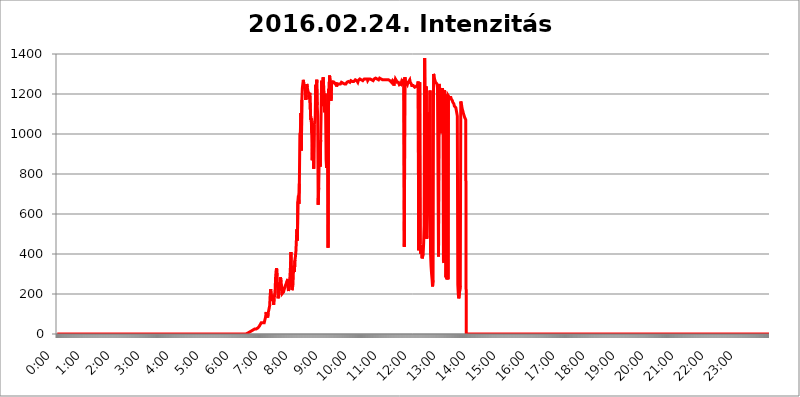
| Category | 2016.02.24. Intenzitás [W/m^2] |
|---|---|
| 0.0 | 0 |
| 0.0006944444444444445 | 0 |
| 0.001388888888888889 | 0 |
| 0.0020833333333333333 | 0 |
| 0.002777777777777778 | 0 |
| 0.003472222222222222 | 0 |
| 0.004166666666666667 | 0 |
| 0.004861111111111111 | 0 |
| 0.005555555555555556 | 0 |
| 0.0062499999999999995 | 0 |
| 0.006944444444444444 | 0 |
| 0.007638888888888889 | 0 |
| 0.008333333333333333 | 0 |
| 0.009027777777777779 | 0 |
| 0.009722222222222222 | 0 |
| 0.010416666666666666 | 0 |
| 0.011111111111111112 | 0 |
| 0.011805555555555555 | 0 |
| 0.012499999999999999 | 0 |
| 0.013194444444444444 | 0 |
| 0.013888888888888888 | 0 |
| 0.014583333333333332 | 0 |
| 0.015277777777777777 | 0 |
| 0.015972222222222224 | 0 |
| 0.016666666666666666 | 0 |
| 0.017361111111111112 | 0 |
| 0.018055555555555557 | 0 |
| 0.01875 | 0 |
| 0.019444444444444445 | 0 |
| 0.02013888888888889 | 0 |
| 0.020833333333333332 | 0 |
| 0.02152777777777778 | 0 |
| 0.022222222222222223 | 0 |
| 0.02291666666666667 | 0 |
| 0.02361111111111111 | 0 |
| 0.024305555555555556 | 0 |
| 0.024999999999999998 | 0 |
| 0.025694444444444447 | 0 |
| 0.02638888888888889 | 0 |
| 0.027083333333333334 | 0 |
| 0.027777777777777776 | 0 |
| 0.02847222222222222 | 0 |
| 0.029166666666666664 | 0 |
| 0.029861111111111113 | 0 |
| 0.030555555555555555 | 0 |
| 0.03125 | 0 |
| 0.03194444444444445 | 0 |
| 0.03263888888888889 | 0 |
| 0.03333333333333333 | 0 |
| 0.034027777777777775 | 0 |
| 0.034722222222222224 | 0 |
| 0.035416666666666666 | 0 |
| 0.036111111111111115 | 0 |
| 0.03680555555555556 | 0 |
| 0.0375 | 0 |
| 0.03819444444444444 | 0 |
| 0.03888888888888889 | 0 |
| 0.03958333333333333 | 0 |
| 0.04027777777777778 | 0 |
| 0.04097222222222222 | 0 |
| 0.041666666666666664 | 0 |
| 0.042361111111111106 | 0 |
| 0.04305555555555556 | 0 |
| 0.043750000000000004 | 0 |
| 0.044444444444444446 | 0 |
| 0.04513888888888889 | 0 |
| 0.04583333333333334 | 0 |
| 0.04652777777777778 | 0 |
| 0.04722222222222222 | 0 |
| 0.04791666666666666 | 0 |
| 0.04861111111111111 | 0 |
| 0.049305555555555554 | 0 |
| 0.049999999999999996 | 0 |
| 0.05069444444444445 | 0 |
| 0.051388888888888894 | 0 |
| 0.052083333333333336 | 0 |
| 0.05277777777777778 | 0 |
| 0.05347222222222222 | 0 |
| 0.05416666666666667 | 0 |
| 0.05486111111111111 | 0 |
| 0.05555555555555555 | 0 |
| 0.05625 | 0 |
| 0.05694444444444444 | 0 |
| 0.057638888888888885 | 0 |
| 0.05833333333333333 | 0 |
| 0.05902777777777778 | 0 |
| 0.059722222222222225 | 0 |
| 0.06041666666666667 | 0 |
| 0.061111111111111116 | 0 |
| 0.06180555555555556 | 0 |
| 0.0625 | 0 |
| 0.06319444444444444 | 0 |
| 0.06388888888888888 | 0 |
| 0.06458333333333334 | 0 |
| 0.06527777777777778 | 0 |
| 0.06597222222222222 | 0 |
| 0.06666666666666667 | 0 |
| 0.06736111111111111 | 0 |
| 0.06805555555555555 | 0 |
| 0.06874999999999999 | 0 |
| 0.06944444444444443 | 0 |
| 0.07013888888888889 | 0 |
| 0.07083333333333333 | 0 |
| 0.07152777777777779 | 0 |
| 0.07222222222222223 | 0 |
| 0.07291666666666667 | 0 |
| 0.07361111111111111 | 0 |
| 0.07430555555555556 | 0 |
| 0.075 | 0 |
| 0.07569444444444444 | 0 |
| 0.0763888888888889 | 0 |
| 0.07708333333333334 | 0 |
| 0.07777777777777778 | 0 |
| 0.07847222222222222 | 0 |
| 0.07916666666666666 | 0 |
| 0.0798611111111111 | 0 |
| 0.08055555555555556 | 0 |
| 0.08125 | 0 |
| 0.08194444444444444 | 0 |
| 0.08263888888888889 | 0 |
| 0.08333333333333333 | 0 |
| 0.08402777777777777 | 0 |
| 0.08472222222222221 | 0 |
| 0.08541666666666665 | 0 |
| 0.08611111111111112 | 0 |
| 0.08680555555555557 | 0 |
| 0.08750000000000001 | 0 |
| 0.08819444444444445 | 0 |
| 0.08888888888888889 | 0 |
| 0.08958333333333333 | 0 |
| 0.09027777777777778 | 0 |
| 0.09097222222222222 | 0 |
| 0.09166666666666667 | 0 |
| 0.09236111111111112 | 0 |
| 0.09305555555555556 | 0 |
| 0.09375 | 0 |
| 0.09444444444444444 | 0 |
| 0.09513888888888888 | 0 |
| 0.09583333333333333 | 0 |
| 0.09652777777777777 | 0 |
| 0.09722222222222222 | 0 |
| 0.09791666666666667 | 0 |
| 0.09861111111111111 | 0 |
| 0.09930555555555555 | 0 |
| 0.09999999999999999 | 0 |
| 0.10069444444444443 | 0 |
| 0.1013888888888889 | 0 |
| 0.10208333333333335 | 0 |
| 0.10277777777777779 | 0 |
| 0.10347222222222223 | 0 |
| 0.10416666666666667 | 0 |
| 0.10486111111111111 | 0 |
| 0.10555555555555556 | 0 |
| 0.10625 | 0 |
| 0.10694444444444444 | 0 |
| 0.1076388888888889 | 0 |
| 0.10833333333333334 | 0 |
| 0.10902777777777778 | 0 |
| 0.10972222222222222 | 0 |
| 0.1111111111111111 | 0 |
| 0.11180555555555556 | 0 |
| 0.11180555555555556 | 0 |
| 0.1125 | 0 |
| 0.11319444444444444 | 0 |
| 0.11388888888888889 | 0 |
| 0.11458333333333333 | 0 |
| 0.11527777777777777 | 0 |
| 0.11597222222222221 | 0 |
| 0.11666666666666665 | 0 |
| 0.1173611111111111 | 0 |
| 0.11805555555555557 | 0 |
| 0.11944444444444445 | 0 |
| 0.12013888888888889 | 0 |
| 0.12083333333333333 | 0 |
| 0.12152777777777778 | 0 |
| 0.12222222222222223 | 0 |
| 0.12291666666666667 | 0 |
| 0.12291666666666667 | 0 |
| 0.12361111111111112 | 0 |
| 0.12430555555555556 | 0 |
| 0.125 | 0 |
| 0.12569444444444444 | 0 |
| 0.12638888888888888 | 0 |
| 0.12708333333333333 | 0 |
| 0.16875 | 0 |
| 0.12847222222222224 | 0 |
| 0.12916666666666668 | 0 |
| 0.12986111111111112 | 0 |
| 0.13055555555555556 | 0 |
| 0.13125 | 0 |
| 0.13194444444444445 | 0 |
| 0.1326388888888889 | 0 |
| 0.13333333333333333 | 0 |
| 0.13402777777777777 | 0 |
| 0.13402777777777777 | 0 |
| 0.13472222222222222 | 0 |
| 0.13541666666666666 | 0 |
| 0.1361111111111111 | 0 |
| 0.13749999999999998 | 0 |
| 0.13819444444444443 | 0 |
| 0.1388888888888889 | 0 |
| 0.13958333333333334 | 0 |
| 0.14027777777777778 | 0 |
| 0.14097222222222222 | 0 |
| 0.14166666666666666 | 0 |
| 0.1423611111111111 | 0 |
| 0.14305555555555557 | 0 |
| 0.14375000000000002 | 0 |
| 0.14444444444444446 | 0 |
| 0.1451388888888889 | 0 |
| 0.1451388888888889 | 0 |
| 0.14652777777777778 | 0 |
| 0.14722222222222223 | 0 |
| 0.14791666666666667 | 0 |
| 0.1486111111111111 | 0 |
| 0.14930555555555555 | 0 |
| 0.15 | 0 |
| 0.15069444444444444 | 0 |
| 0.15138888888888888 | 0 |
| 0.15208333333333332 | 0 |
| 0.15277777777777776 | 0 |
| 0.15347222222222223 | 0 |
| 0.15416666666666667 | 0 |
| 0.15486111111111112 | 0 |
| 0.15555555555555556 | 0 |
| 0.15625 | 0 |
| 0.15694444444444444 | 0 |
| 0.15763888888888888 | 0 |
| 0.15833333333333333 | 0 |
| 0.15902777777777777 | 0 |
| 0.15972222222222224 | 0 |
| 0.16041666666666668 | 0 |
| 0.16111111111111112 | 0 |
| 0.16180555555555556 | 0 |
| 0.1625 | 0 |
| 0.16319444444444445 | 0 |
| 0.1638888888888889 | 0 |
| 0.16458333333333333 | 0 |
| 0.16527777777777777 | 0 |
| 0.16597222222222222 | 0 |
| 0.16666666666666666 | 0 |
| 0.1673611111111111 | 0 |
| 0.16805555555555554 | 0 |
| 0.16874999999999998 | 0 |
| 0.16944444444444443 | 0 |
| 0.17013888888888887 | 0 |
| 0.1708333333333333 | 0 |
| 0.17152777777777775 | 0 |
| 0.17222222222222225 | 0 |
| 0.1729166666666667 | 0 |
| 0.17361111111111113 | 0 |
| 0.17430555555555557 | 0 |
| 0.17500000000000002 | 0 |
| 0.17569444444444446 | 0 |
| 0.1763888888888889 | 0 |
| 0.17708333333333334 | 0 |
| 0.17777777777777778 | 0 |
| 0.17847222222222223 | 0 |
| 0.17916666666666667 | 0 |
| 0.1798611111111111 | 0 |
| 0.18055555555555555 | 0 |
| 0.18125 | 0 |
| 0.18194444444444444 | 0 |
| 0.1826388888888889 | 0 |
| 0.18333333333333335 | 0 |
| 0.1840277777777778 | 0 |
| 0.18472222222222223 | 0 |
| 0.18541666666666667 | 0 |
| 0.18611111111111112 | 0 |
| 0.18680555555555556 | 0 |
| 0.1875 | 0 |
| 0.18819444444444444 | 0 |
| 0.18888888888888888 | 0 |
| 0.18958333333333333 | 0 |
| 0.19027777777777777 | 0 |
| 0.1909722222222222 | 0 |
| 0.19166666666666665 | 0 |
| 0.19236111111111112 | 0 |
| 0.19305555555555554 | 0 |
| 0.19375 | 0 |
| 0.19444444444444445 | 0 |
| 0.1951388888888889 | 0 |
| 0.19583333333333333 | 0 |
| 0.19652777777777777 | 0 |
| 0.19722222222222222 | 0 |
| 0.19791666666666666 | 0 |
| 0.1986111111111111 | 0 |
| 0.19930555555555554 | 0 |
| 0.19999999999999998 | 0 |
| 0.20069444444444443 | 0 |
| 0.20138888888888887 | 0 |
| 0.2020833333333333 | 0 |
| 0.2027777777777778 | 0 |
| 0.2034722222222222 | 0 |
| 0.2041666666666667 | 0 |
| 0.20486111111111113 | 0 |
| 0.20555555555555557 | 0 |
| 0.20625000000000002 | 0 |
| 0.20694444444444446 | 0 |
| 0.2076388888888889 | 0 |
| 0.20833333333333334 | 0 |
| 0.20902777777777778 | 0 |
| 0.20972222222222223 | 0 |
| 0.21041666666666667 | 0 |
| 0.2111111111111111 | 0 |
| 0.21180555555555555 | 0 |
| 0.2125 | 0 |
| 0.21319444444444444 | 0 |
| 0.2138888888888889 | 0 |
| 0.21458333333333335 | 0 |
| 0.2152777777777778 | 0 |
| 0.21597222222222223 | 0 |
| 0.21666666666666667 | 0 |
| 0.21736111111111112 | 0 |
| 0.21805555555555556 | 0 |
| 0.21875 | 0 |
| 0.21944444444444444 | 0 |
| 0.22013888888888888 | 0 |
| 0.22083333333333333 | 0 |
| 0.22152777777777777 | 0 |
| 0.2222222222222222 | 0 |
| 0.22291666666666665 | 0 |
| 0.2236111111111111 | 0 |
| 0.22430555555555556 | 0 |
| 0.225 | 0 |
| 0.22569444444444445 | 0 |
| 0.2263888888888889 | 0 |
| 0.22708333333333333 | 0 |
| 0.22777777777777777 | 0 |
| 0.22847222222222222 | 0 |
| 0.22916666666666666 | 0 |
| 0.2298611111111111 | 0 |
| 0.23055555555555554 | 0 |
| 0.23124999999999998 | 0 |
| 0.23194444444444443 | 0 |
| 0.23263888888888887 | 0 |
| 0.2333333333333333 | 0 |
| 0.2340277777777778 | 0 |
| 0.2347222222222222 | 0 |
| 0.2354166666666667 | 0 |
| 0.23611111111111113 | 0 |
| 0.23680555555555557 | 0 |
| 0.23750000000000002 | 0 |
| 0.23819444444444446 | 0 |
| 0.2388888888888889 | 0 |
| 0.23958333333333334 | 0 |
| 0.24027777777777778 | 0 |
| 0.24097222222222223 | 0 |
| 0.24166666666666667 | 0 |
| 0.2423611111111111 | 0 |
| 0.24305555555555555 | 0 |
| 0.24375 | 0 |
| 0.24444444444444446 | 0 |
| 0.24513888888888888 | 0 |
| 0.24583333333333335 | 0 |
| 0.2465277777777778 | 0 |
| 0.24722222222222223 | 0 |
| 0.24791666666666667 | 0 |
| 0.24861111111111112 | 0 |
| 0.24930555555555556 | 0 |
| 0.25 | 0 |
| 0.25069444444444444 | 0 |
| 0.2513888888888889 | 0 |
| 0.2520833333333333 | 0 |
| 0.25277777777777777 | 0 |
| 0.2534722222222222 | 0 |
| 0.25416666666666665 | 0 |
| 0.2548611111111111 | 0 |
| 0.2555555555555556 | 0 |
| 0.25625000000000003 | 0 |
| 0.2569444444444445 | 0 |
| 0.2576388888888889 | 0 |
| 0.25833333333333336 | 0 |
| 0.2590277777777778 | 0 |
| 0.25972222222222224 | 0 |
| 0.2604166666666667 | 0 |
| 0.2611111111111111 | 0 |
| 0.26180555555555557 | 0 |
| 0.2625 | 0 |
| 0.26319444444444445 | 0 |
| 0.2638888888888889 | 0 |
| 0.26458333333333334 | 0 |
| 0.2652777777777778 | 3.525 |
| 0.2659722222222222 | 3.525 |
| 0.26666666666666666 | 3.525 |
| 0.2673611111111111 | 3.525 |
| 0.26805555555555555 | 3.525 |
| 0.26875 | 7.887 |
| 0.26944444444444443 | 7.887 |
| 0.2701388888888889 | 7.887 |
| 0.2708333333333333 | 12.257 |
| 0.27152777777777776 | 12.257 |
| 0.2722222222222222 | 12.257 |
| 0.27291666666666664 | 16.636 |
| 0.2736111111111111 | 16.636 |
| 0.2743055555555555 | 21.024 |
| 0.27499999999999997 | 21.024 |
| 0.27569444444444446 | 25.419 |
| 0.27638888888888885 | 25.419 |
| 0.27708333333333335 | 25.419 |
| 0.2777777777777778 | 25.419 |
| 0.27847222222222223 | 25.419 |
| 0.2791666666666667 | 25.419 |
| 0.2798611111111111 | 25.419 |
| 0.28055555555555556 | 25.419 |
| 0.28125 | 29.823 |
| 0.28194444444444444 | 29.823 |
| 0.2826388888888889 | 34.234 |
| 0.2833333333333333 | 38.653 |
| 0.28402777777777777 | 38.653 |
| 0.2847222222222222 | 47.511 |
| 0.28541666666666665 | 51.951 |
| 0.28611111111111115 | 56.398 |
| 0.28680555555555554 | 56.398 |
| 0.28750000000000003 | 56.398 |
| 0.2881944444444445 | 56.398 |
| 0.2888888888888889 | 56.398 |
| 0.28958333333333336 | 56.398 |
| 0.2902777777777778 | 56.398 |
| 0.29097222222222224 | 56.398 |
| 0.2916666666666667 | 60.85 |
| 0.2923611111111111 | 87.692 |
| 0.29305555555555557 | 110.201 |
| 0.29375 | 83.205 |
| 0.29444444444444445 | 96.682 |
| 0.2951388888888889 | 83.205 |
| 0.29583333333333334 | 105.69 |
| 0.2965277777777778 | 101.184 |
| 0.2972222222222222 | 128.284 |
| 0.29791666666666666 | 141.884 |
| 0.2986111111111111 | 191.937 |
| 0.29930555555555555 | 223.873 |
| 0.3 | 201.058 |
| 0.30069444444444443 | 191.937 |
| 0.3013888888888889 | 191.937 |
| 0.3020833333333333 | 164.605 |
| 0.30277777777777776 | 196.497 |
| 0.3034722222222222 | 146.423 |
| 0.30416666666666664 | 178.264 |
| 0.3048611111111111 | 191.937 |
| 0.3055555555555555 | 219.309 |
| 0.30624999999999997 | 283.156 |
| 0.3069444444444444 | 314.98 |
| 0.3076388888888889 | 328.584 |
| 0.30833333333333335 | 287.709 |
| 0.3090277777777778 | 237.564 |
| 0.30972222222222223 | 178.264 |
| 0.3104166666666667 | 173.709 |
| 0.3111111111111111 | 210.182 |
| 0.31180555555555556 | 242.127 |
| 0.3125 | 219.309 |
| 0.31319444444444444 | 283.156 |
| 0.3138888888888889 | 260.373 |
| 0.3145833333333333 | 242.127 |
| 0.31527777777777777 | 201.058 |
| 0.3159722222222222 | 196.497 |
| 0.31666666666666665 | 196.497 |
| 0.31736111111111115 | 210.182 |
| 0.31805555555555554 | 205.62 |
| 0.31875000000000003 | 214.746 |
| 0.3194444444444445 | 237.564 |
| 0.3201388888888889 | 233 |
| 0.32083333333333336 | 242.127 |
| 0.3215277777777778 | 255.813 |
| 0.32222222222222224 | 242.127 |
| 0.3229166666666667 | 274.047 |
| 0.3236111111111111 | 233 |
| 0.32430555555555557 | 214.746 |
| 0.325 | 251.251 |
| 0.32569444444444445 | 260.373 |
| 0.3263888888888889 | 287.709 |
| 0.32708333333333334 | 337.639 |
| 0.3277777777777778 | 409.574 |
| 0.3284722222222222 | 242.127 |
| 0.32916666666666666 | 219.309 |
| 0.3298611111111111 | 228.436 |
| 0.33055555555555555 | 246.689 |
| 0.33125 | 310.44 |
| 0.33194444444444443 | 342.162 |
| 0.3326388888888889 | 310.44 |
| 0.3333333333333333 | 369.23 |
| 0.3340277777777778 | 387.202 |
| 0.3347222222222222 | 414.035 |
| 0.3354166666666667 | 409.574 |
| 0.3361111111111111 | 523.88 |
| 0.3368055555555556 | 467.187 |
| 0.33749999999999997 | 663.019 |
| 0.33819444444444446 | 691.608 |
| 0.33888888888888885 | 650.667 |
| 0.33958333333333335 | 751.803 |
| 0.34027777777777773 | 999.916 |
| 0.34097222222222223 | 1007.383 |
| 0.3416666666666666 | 1105.019 |
| 0.3423611111111111 | 917.534 |
| 0.3430555555555555 | 1170.358 |
| 0.34375 | 1229.899 |
| 0.3444444444444445 | 1250.275 |
| 0.3451388888888889 | 1270.964 |
| 0.3458333333333334 | 1250.275 |
| 0.34652777777777777 | 1233.951 |
| 0.34722222222222227 | 1225.859 |
| 0.34791666666666665 | 1233.951 |
| 0.34861111111111115 | 1170.358 |
| 0.34930555555555554 | 1193.918 |
| 0.35000000000000003 | 1250.275 |
| 0.3506944444444444 | 1233.951 |
| 0.3513888888888889 | 1217.812 |
| 0.3520833333333333 | 1217.812 |
| 0.3527777777777778 | 1201.843 |
| 0.3534722222222222 | 1174.263 |
| 0.3541666666666667 | 1205.82 |
| 0.3548611111111111 | 1209.807 |
| 0.35555555555555557 | 1071.027 |
| 0.35625 | 1078.555 |
| 0.35694444444444445 | 1003.65 |
| 0.3576388888888889 | 868.305 |
| 0.35833333333333334 | 1041.019 |
| 0.3590277777777778 | 1014.852 |
| 0.3597222222222222 | 826.123 |
| 0.36041666666666666 | 1044.762 |
| 0.3611111111111111 | 1059.756 |
| 0.36180555555555555 | 1086.097 |
| 0.3625 | 1246.176 |
| 0.36319444444444443 | 1166.46 |
| 0.3638888888888889 | 1270.964 |
| 0.3645833333333333 | 1143.232 |
| 0.3652777777777778 | 1093.653 |
| 0.3659722222222222 | 646.537 |
| 0.3666666666666667 | 731.896 |
| 0.3673611111111111 | 875.918 |
| 0.3680555555555556 | 943.832 |
| 0.36874999999999997 | 837.682 |
| 0.36944444444444446 | 970.034 |
| 0.37013888888888885 | 973.772 |
| 0.37083333333333335 | 1266.8 |
| 0.37152777777777773 | 1139.384 |
| 0.37222222222222223 | 1217.812 |
| 0.3729166666666666 | 1283.541 |
| 0.3736111111111111 | 1242.089 |
| 0.3743055555555555 | 1189.969 |
| 0.375 | 1108.816 |
| 0.3756944444444445 | 1201.843 |
| 0.3763888888888889 | 1116.426 |
| 0.3770833333333334 | 872.114 |
| 0.37777777777777777 | 829.981 |
| 0.37847222222222227 | 1063.51 |
| 0.37916666666666665 | 868.305 |
| 0.37986111111111115 | 431.833 |
| 0.38055555555555554 | 1225.859 |
| 0.38125000000000003 | 1213.804 |
| 0.3819444444444444 | 1291.997 |
| 0.3826388888888889 | 1266.8 |
| 0.3833333333333333 | 1262.649 |
| 0.3840277777777778 | 1166.46 |
| 0.3847222222222222 | 1246.176 |
| 0.3854166666666667 | 1266.8 |
| 0.3861111111111111 | 1254.387 |
| 0.38680555555555557 | 1254.387 |
| 0.3875 | 1250.275 |
| 0.38819444444444445 | 1258.511 |
| 0.3888888888888889 | 1258.511 |
| 0.38958333333333334 | 1258.511 |
| 0.3902777777777778 | 1250.275 |
| 0.3909722222222222 | 1258.511 |
| 0.39166666666666666 | 1238.014 |
| 0.3923611111111111 | 1242.089 |
| 0.39305555555555555 | 1250.275 |
| 0.39375 | 1250.275 |
| 0.39444444444444443 | 1254.387 |
| 0.3951388888888889 | 1250.275 |
| 0.3958333333333333 | 1254.387 |
| 0.3965277777777778 | 1250.275 |
| 0.3972222222222222 | 1250.275 |
| 0.3979166666666667 | 1246.176 |
| 0.3986111111111111 | 1258.511 |
| 0.3993055555555556 | 1258.511 |
| 0.39999999999999997 | 1258.511 |
| 0.40069444444444446 | 1254.387 |
| 0.40138888888888885 | 1254.387 |
| 0.40208333333333335 | 1250.275 |
| 0.40277777777777773 | 1250.275 |
| 0.40347222222222223 | 1254.387 |
| 0.4041666666666666 | 1250.275 |
| 0.4048611111111111 | 1250.275 |
| 0.4055555555555555 | 1254.387 |
| 0.40625 | 1258.511 |
| 0.4069444444444445 | 1262.649 |
| 0.4076388888888889 | 1262.649 |
| 0.4083333333333334 | 1262.649 |
| 0.40902777777777777 | 1262.649 |
| 0.40972222222222227 | 1266.8 |
| 0.41041666666666665 | 1258.511 |
| 0.41111111111111115 | 1262.649 |
| 0.41180555555555554 | 1266.8 |
| 0.41250000000000003 | 1266.8 |
| 0.4131944444444444 | 1266.8 |
| 0.4138888888888889 | 1262.649 |
| 0.4145833333333333 | 1262.649 |
| 0.4152777777777778 | 1262.649 |
| 0.4159722222222222 | 1262.649 |
| 0.4166666666666667 | 1262.649 |
| 0.4173611111111111 | 1262.649 |
| 0.41805555555555557 | 1270.964 |
| 0.41875 | 1266.8 |
| 0.41944444444444445 | 1270.964 |
| 0.4201388888888889 | 1266.8 |
| 0.42083333333333334 | 1266.8 |
| 0.4215277777777778 | 1258.511 |
| 0.4222222222222222 | 1266.8 |
| 0.42291666666666666 | 1270.964 |
| 0.4236111111111111 | 1270.964 |
| 0.42430555555555555 | 1275.142 |
| 0.425 | 1275.142 |
| 0.42569444444444443 | 1270.964 |
| 0.4263888888888889 | 1270.964 |
| 0.4270833333333333 | 1275.142 |
| 0.4277777777777778 | 1270.964 |
| 0.4284722222222222 | 1266.8 |
| 0.4291666666666667 | 1266.8 |
| 0.4298611111111111 | 1270.964 |
| 0.4305555555555556 | 1275.142 |
| 0.43124999999999997 | 1275.142 |
| 0.43194444444444446 | 1275.142 |
| 0.43263888888888885 | 1275.142 |
| 0.43333333333333335 | 1270.964 |
| 0.43402777777777773 | 1275.142 |
| 0.43472222222222223 | 1275.142 |
| 0.4354166666666666 | 1266.8 |
| 0.4361111111111111 | 1262.649 |
| 0.4368055555555555 | 1275.142 |
| 0.4375 | 1270.964 |
| 0.4381944444444445 | 1275.142 |
| 0.4388888888888889 | 1275.142 |
| 0.4395833333333334 | 1275.142 |
| 0.44027777777777777 | 1275.142 |
| 0.44097222222222227 | 1270.964 |
| 0.44166666666666665 | 1270.964 |
| 0.44236111111111115 | 1266.8 |
| 0.44305555555555554 | 1266.8 |
| 0.44375000000000003 | 1266.8 |
| 0.4444444444444444 | 1275.142 |
| 0.4451388888888889 | 1270.964 |
| 0.4458333333333333 | 1270.964 |
| 0.4465277777777778 | 1279.334 |
| 0.4472222222222222 | 1275.142 |
| 0.4479166666666667 | 1275.142 |
| 0.4486111111111111 | 1275.142 |
| 0.44930555555555557 | 1279.334 |
| 0.45 | 1275.142 |
| 0.45069444444444445 | 1270.964 |
| 0.4513888888888889 | 1275.142 |
| 0.45208333333333334 | 1279.334 |
| 0.4527777777777778 | 1279.334 |
| 0.4534722222222222 | 1275.142 |
| 0.45416666666666666 | 1275.142 |
| 0.4548611111111111 | 1270.964 |
| 0.45555555555555555 | 1270.964 |
| 0.45625 | 1270.964 |
| 0.45694444444444443 | 1275.142 |
| 0.4576388888888889 | 1266.8 |
| 0.4583333333333333 | 1270.964 |
| 0.4590277777777778 | 1275.142 |
| 0.4597222222222222 | 1270.964 |
| 0.4604166666666667 | 1270.964 |
| 0.4611111111111111 | 1270.964 |
| 0.4618055555555556 | 1270.964 |
| 0.46249999999999997 | 1270.964 |
| 0.46319444444444446 | 1270.964 |
| 0.46388888888888885 | 1270.964 |
| 0.46458333333333335 | 1270.964 |
| 0.46527777777777773 | 1270.964 |
| 0.46597222222222223 | 1270.964 |
| 0.4666666666666666 | 1266.8 |
| 0.4673611111111111 | 1262.649 |
| 0.4680555555555555 | 1262.649 |
| 0.46875 | 1258.511 |
| 0.4694444444444445 | 1254.387 |
| 0.4701388888888889 | 1266.8 |
| 0.4708333333333334 | 1266.8 |
| 0.47152777777777777 | 1258.511 |
| 0.47222222222222227 | 1242.089 |
| 0.47291666666666665 | 1270.964 |
| 0.47361111111111115 | 1262.649 |
| 0.47430555555555554 | 1275.142 |
| 0.47500000000000003 | 1270.964 |
| 0.4756944444444444 | 1266.8 |
| 0.4763888888888889 | 1258.511 |
| 0.4770833333333333 | 1262.649 |
| 0.4777777777777778 | 1258.511 |
| 0.4784722222222222 | 1258.511 |
| 0.4791666666666667 | 1254.387 |
| 0.4798611111111111 | 1246.176 |
| 0.48055555555555557 | 1250.275 |
| 0.48125 | 1242.089 |
| 0.48194444444444445 | 1250.275 |
| 0.4826388888888889 | 1258.511 |
| 0.48333333333333334 | 1250.275 |
| 0.4840277777777778 | 1250.275 |
| 0.4847222222222222 | 1250.275 |
| 0.48541666666666666 | 1258.511 |
| 0.4861111111111111 | 1275.142 |
| 0.48680555555555555 | 436.27 |
| 0.4875 | 1283.541 |
| 0.48819444444444443 | 1266.8 |
| 0.4888888888888889 | 1266.8 |
| 0.4895833333333333 | 1254.387 |
| 0.4902777777777778 | 1254.387 |
| 0.4909722222222222 | 1246.176 |
| 0.4916666666666667 | 1254.387 |
| 0.4923611111111111 | 1254.387 |
| 0.4930555555555556 | 1262.649 |
| 0.49374999999999997 | 1258.511 |
| 0.49444444444444446 | 1270.964 |
| 0.49513888888888885 | 1258.511 |
| 0.49583333333333335 | 1258.511 |
| 0.49652777777777773 | 1250.275 |
| 0.49722222222222223 | 1242.089 |
| 0.4979166666666666 | 1238.014 |
| 0.4986111111111111 | 1238.014 |
| 0.4993055555555555 | 1242.089 |
| 0.5 | 1242.089 |
| 0.5006944444444444 | 1242.089 |
| 0.5013888888888889 | 1233.951 |
| 0.5020833333333333 | 1233.951 |
| 0.5027777777777778 | 1238.014 |
| 0.5034722222222222 | 1238.014 |
| 0.5041666666666667 | 1233.951 |
| 0.5048611111111111 | 1238.014 |
| 0.5055555555555555 | 1246.176 |
| 0.50625 | 1262.649 |
| 0.5069444444444444 | 418.492 |
| 0.5076388888888889 | 663.019 |
| 0.5083333333333333 | 1258.511 |
| 0.5090277777777777 | 449.551 |
| 0.5097222222222222 | 400.638 |
| 0.5104166666666666 | 418.492 |
| 0.5111111111111112 | 445.129 |
| 0.5118055555555555 | 378.224 |
| 0.5125000000000001 | 373.729 |
| 0.5131944444444444 | 400.638 |
| 0.513888888888889 | 453.968 |
| 0.5145833333333333 | 541.121 |
| 0.5152777777777778 | 1380.22 |
| 0.5159722222222222 | 1048.508 |
| 0.5166666666666667 | 845.365 |
| 0.517361111111111 | 1238.014 |
| 0.5180555555555556 | 475.972 |
| 0.5187499999999999 | 489.108 |
| 0.5194444444444445 | 625.784 |
| 0.5201388888888888 | 1108.816 |
| 0.5208333333333334 | 973.772 |
| 0.5215277777777778 | 642.4 |
| 0.5222222222222223 | 1022.323 |
| 0.5229166666666667 | 1217.812 |
| 0.5236111111111111 | 396.164 |
| 0.5243055555555556 | 337.639 |
| 0.525 | 301.354 |
| 0.5256944444444445 | 274.047 |
| 0.5263888888888889 | 237.564 |
| 0.5270833333333333 | 269.49 |
| 0.5277777777777778 | 1300.514 |
| 0.5284722222222222 | 1291.997 |
| 0.5291666666666667 | 1275.142 |
| 0.5298611111111111 | 1270.964 |
| 0.5305555555555556 | 1258.511 |
| 0.53125 | 1262.649 |
| 0.5319444444444444 | 1262.649 |
| 0.5326388888888889 | 1250.275 |
| 0.5333333333333333 | 1229.899 |
| 0.5340277777777778 | 1233.951 |
| 0.5347222222222222 | 387.202 |
| 0.5354166666666667 | 1250.275 |
| 0.5361111111111111 | 1229.899 |
| 0.5368055555555555 | 1233.951 |
| 0.5375 | 1225.859 |
| 0.5381944444444444 | 1003.65 |
| 0.5388888888888889 | 1217.812 |
| 0.5395833333333333 | 1209.807 |
| 0.5402777777777777 | 1229.899 |
| 0.5409722222222222 | 1201.843 |
| 0.5416666666666666 | 364.728 |
| 0.5423611111111112 | 355.712 |
| 0.5430555555555555 | 1217.812 |
| 0.5437500000000001 | 1209.807 |
| 0.5444444444444444 | 833.834 |
| 0.545138888888889 | 283.156 |
| 0.5458333333333333 | 484.735 |
| 0.5465277777777778 | 274.047 |
| 0.5472222222222222 | 1197.876 |
| 0.5479166666666667 | 274.047 |
| 0.548611111111111 | 1189.969 |
| 0.5493055555555556 | 1189.969 |
| 0.5499999999999999 | 1182.099 |
| 0.5506944444444445 | 1186.03 |
| 0.5513888888888888 | 1186.03 |
| 0.5520833333333334 | 1182.099 |
| 0.5527777777777778 | 1174.263 |
| 0.5534722222222223 | 1170.358 |
| 0.5541666666666667 | 1166.46 |
| 0.5548611111111111 | 1158.689 |
| 0.5555555555555556 | 1158.689 |
| 0.55625 | 1150.946 |
| 0.5569444444444445 | 1139.384 |
| 0.5576388888888889 | 1139.384 |
| 0.5583333333333333 | 1139.384 |
| 0.5590277777777778 | 1131.708 |
| 0.5597222222222222 | 1135.543 |
| 0.5604166666666667 | 1127.879 |
| 0.5611111111111111 | 1089.873 |
| 0.5618055555555556 | 246.689 |
| 0.5625 | 196.497 |
| 0.5631944444444444 | 178.264 |
| 0.5638888888888889 | 173.709 |
| 0.5645833333333333 | 178.264 |
| 0.5652777777777778 | 242.127 |
| 0.5659722222222222 | 1162.571 |
| 0.5666666666666667 | 1150.946 |
| 0.5673611111111111 | 1139.384 |
| 0.5680555555555555 | 1124.056 |
| 0.56875 | 1116.426 |
| 0.5694444444444444 | 1105.019 |
| 0.5701388888888889 | 1097.437 |
| 0.5708333333333333 | 1089.873 |
| 0.5715277777777777 | 1082.324 |
| 0.5722222222222222 | 1078.555 |
| 0.5729166666666666 | 1071.027 |
| 0.5736111111111112 | 0 |
| 0.5743055555555555 | 0 |
| 0.5750000000000001 | 0 |
| 0.5756944444444444 | 0 |
| 0.576388888888889 | 0 |
| 0.5770833333333333 | 0 |
| 0.5777777777777778 | 0 |
| 0.5784722222222222 | 0 |
| 0.5791666666666667 | 0 |
| 0.579861111111111 | 0 |
| 0.5805555555555556 | 0 |
| 0.5812499999999999 | 0 |
| 0.5819444444444445 | 0 |
| 0.5826388888888888 | 0 |
| 0.5833333333333334 | 0 |
| 0.5840277777777778 | 0 |
| 0.5847222222222223 | 0 |
| 0.5854166666666667 | 0 |
| 0.5861111111111111 | 0 |
| 0.5868055555555556 | 0 |
| 0.5875 | 0 |
| 0.5881944444444445 | 0 |
| 0.5888888888888889 | 0 |
| 0.5895833333333333 | 0 |
| 0.5902777777777778 | 0 |
| 0.5909722222222222 | 0 |
| 0.5916666666666667 | 0 |
| 0.5923611111111111 | 0 |
| 0.5930555555555556 | 0 |
| 0.59375 | 0 |
| 0.5944444444444444 | 0 |
| 0.5951388888888889 | 0 |
| 0.5958333333333333 | 0 |
| 0.5965277777777778 | 0 |
| 0.5972222222222222 | 0 |
| 0.5979166666666667 | 0 |
| 0.5986111111111111 | 0 |
| 0.5993055555555555 | 0 |
| 0.6 | 0 |
| 0.6006944444444444 | 0 |
| 0.6013888888888889 | 0 |
| 0.6020833333333333 | 0 |
| 0.6027777777777777 | 0 |
| 0.6034722222222222 | 0 |
| 0.6041666666666666 | 0 |
| 0.6048611111111112 | 0 |
| 0.6055555555555555 | 0 |
| 0.6062500000000001 | 0 |
| 0.6069444444444444 | 0 |
| 0.607638888888889 | 0 |
| 0.6083333333333333 | 0 |
| 0.6090277777777778 | 0 |
| 0.6097222222222222 | 0 |
| 0.6104166666666667 | 0 |
| 0.611111111111111 | 0 |
| 0.6118055555555556 | 0 |
| 0.6124999999999999 | 0 |
| 0.6131944444444445 | 0 |
| 0.6138888888888888 | 0 |
| 0.6145833333333334 | 0 |
| 0.6152777777777778 | 0 |
| 0.6159722222222223 | 0 |
| 0.6166666666666667 | 0 |
| 0.6173611111111111 | 0 |
| 0.6180555555555556 | 0 |
| 0.61875 | 0 |
| 0.6194444444444445 | 0 |
| 0.6201388888888889 | 0 |
| 0.6208333333333333 | 0 |
| 0.6215277777777778 | 0 |
| 0.6222222222222222 | 0 |
| 0.6229166666666667 | 0 |
| 0.6236111111111111 | 0 |
| 0.6243055555555556 | 0 |
| 0.625 | 0 |
| 0.6256944444444444 | 0 |
| 0.6263888888888889 | 0 |
| 0.6270833333333333 | 0 |
| 0.6277777777777778 | 0 |
| 0.6284722222222222 | 0 |
| 0.6291666666666667 | 0 |
| 0.6298611111111111 | 0 |
| 0.6305555555555555 | 0 |
| 0.63125 | 0 |
| 0.6319444444444444 | 0 |
| 0.6326388888888889 | 0 |
| 0.6333333333333333 | 0 |
| 0.6340277777777777 | 0 |
| 0.6347222222222222 | 0 |
| 0.6354166666666666 | 0 |
| 0.6361111111111112 | 0 |
| 0.6368055555555555 | 0 |
| 0.6375000000000001 | 0 |
| 0.6381944444444444 | 0 |
| 0.638888888888889 | 0 |
| 0.6395833333333333 | 0 |
| 0.6402777777777778 | 0 |
| 0.6409722222222222 | 0 |
| 0.6416666666666667 | 0 |
| 0.642361111111111 | 0 |
| 0.6430555555555556 | 0 |
| 0.6437499999999999 | 0 |
| 0.6444444444444445 | 0 |
| 0.6451388888888888 | 0 |
| 0.6458333333333334 | 0 |
| 0.6465277777777778 | 0 |
| 0.6472222222222223 | 0 |
| 0.6479166666666667 | 0 |
| 0.6486111111111111 | 0 |
| 0.6493055555555556 | 0 |
| 0.65 | 0 |
| 0.6506944444444445 | 0 |
| 0.6513888888888889 | 0 |
| 0.6520833333333333 | 0 |
| 0.6527777777777778 | 0 |
| 0.6534722222222222 | 0 |
| 0.6541666666666667 | 0 |
| 0.6548611111111111 | 0 |
| 0.6555555555555556 | 0 |
| 0.65625 | 0 |
| 0.6569444444444444 | 0 |
| 0.6576388888888889 | 0 |
| 0.6583333333333333 | 0 |
| 0.6590277777777778 | 0 |
| 0.6597222222222222 | 0 |
| 0.6604166666666667 | 0 |
| 0.6611111111111111 | 0 |
| 0.6618055555555555 | 0 |
| 0.6625 | 0 |
| 0.6631944444444444 | 0 |
| 0.6638888888888889 | 0 |
| 0.6645833333333333 | 0 |
| 0.6652777777777777 | 0 |
| 0.6659722222222222 | 0 |
| 0.6666666666666666 | 0 |
| 0.6673611111111111 | 0 |
| 0.6680555555555556 | 0 |
| 0.6687500000000001 | 0 |
| 0.6694444444444444 | 0 |
| 0.6701388888888888 | 0 |
| 0.6708333333333334 | 0 |
| 0.6715277777777778 | 0 |
| 0.6722222222222222 | 0 |
| 0.6729166666666666 | 0 |
| 0.6736111111111112 | 0 |
| 0.6743055555555556 | 0 |
| 0.6749999999999999 | 0 |
| 0.6756944444444444 | 0 |
| 0.6763888888888889 | 0 |
| 0.6770833333333334 | 0 |
| 0.6777777777777777 | 0 |
| 0.6784722222222223 | 0 |
| 0.6791666666666667 | 0 |
| 0.6798611111111111 | 0 |
| 0.6805555555555555 | 0 |
| 0.68125 | 0 |
| 0.6819444444444445 | 0 |
| 0.6826388888888889 | 0 |
| 0.6833333333333332 | 0 |
| 0.6840277777777778 | 0 |
| 0.6847222222222222 | 0 |
| 0.6854166666666667 | 0 |
| 0.686111111111111 | 0 |
| 0.6868055555555556 | 0 |
| 0.6875 | 0 |
| 0.6881944444444444 | 0 |
| 0.688888888888889 | 0 |
| 0.6895833333333333 | 0 |
| 0.6902777777777778 | 0 |
| 0.6909722222222222 | 0 |
| 0.6916666666666668 | 0 |
| 0.6923611111111111 | 0 |
| 0.6930555555555555 | 0 |
| 0.69375 | 0 |
| 0.6944444444444445 | 0 |
| 0.6951388888888889 | 0 |
| 0.6958333333333333 | 0 |
| 0.6965277777777777 | 0 |
| 0.6972222222222223 | 0 |
| 0.6979166666666666 | 0 |
| 0.6986111111111111 | 0 |
| 0.6993055555555556 | 0 |
| 0.7000000000000001 | 0 |
| 0.7006944444444444 | 0 |
| 0.7013888888888888 | 0 |
| 0.7020833333333334 | 0 |
| 0.7027777777777778 | 0 |
| 0.7034722222222222 | 0 |
| 0.7041666666666666 | 0 |
| 0.7048611111111112 | 0 |
| 0.7055555555555556 | 0 |
| 0.7062499999999999 | 0 |
| 0.7069444444444444 | 0 |
| 0.7076388888888889 | 0 |
| 0.7083333333333334 | 0 |
| 0.7090277777777777 | 0 |
| 0.7097222222222223 | 0 |
| 0.7104166666666667 | 0 |
| 0.7111111111111111 | 0 |
| 0.7118055555555555 | 0 |
| 0.7125 | 0 |
| 0.7131944444444445 | 0 |
| 0.7138888888888889 | 0 |
| 0.7145833333333332 | 0 |
| 0.7152777777777778 | 0 |
| 0.7159722222222222 | 0 |
| 0.7166666666666667 | 0 |
| 0.717361111111111 | 0 |
| 0.7180555555555556 | 0 |
| 0.71875 | 0 |
| 0.7194444444444444 | 0 |
| 0.720138888888889 | 0 |
| 0.7208333333333333 | 0 |
| 0.7215277777777778 | 0 |
| 0.7222222222222222 | 0 |
| 0.7229166666666668 | 0 |
| 0.7236111111111111 | 0 |
| 0.7243055555555555 | 0 |
| 0.725 | 0 |
| 0.7256944444444445 | 0 |
| 0.7263888888888889 | 0 |
| 0.7270833333333333 | 0 |
| 0.7277777777777777 | 0 |
| 0.7284722222222223 | 0 |
| 0.7291666666666666 | 0 |
| 0.7298611111111111 | 0 |
| 0.7305555555555556 | 0 |
| 0.7312500000000001 | 0 |
| 0.7319444444444444 | 0 |
| 0.7326388888888888 | 0 |
| 0.7333333333333334 | 0 |
| 0.7340277777777778 | 0 |
| 0.7347222222222222 | 0 |
| 0.7354166666666666 | 0 |
| 0.7361111111111112 | 0 |
| 0.7368055555555556 | 0 |
| 0.7374999999999999 | 0 |
| 0.7381944444444444 | 0 |
| 0.7388888888888889 | 0 |
| 0.7395833333333334 | 0 |
| 0.7402777777777777 | 0 |
| 0.7409722222222223 | 0 |
| 0.7416666666666667 | 0 |
| 0.7423611111111111 | 0 |
| 0.7430555555555555 | 0 |
| 0.74375 | 0 |
| 0.7444444444444445 | 0 |
| 0.7451388888888889 | 0 |
| 0.7458333333333332 | 0 |
| 0.7465277777777778 | 0 |
| 0.7472222222222222 | 0 |
| 0.7479166666666667 | 0 |
| 0.748611111111111 | 0 |
| 0.7493055555555556 | 0 |
| 0.75 | 0 |
| 0.7506944444444444 | 0 |
| 0.751388888888889 | 0 |
| 0.7520833333333333 | 0 |
| 0.7527777777777778 | 0 |
| 0.7534722222222222 | 0 |
| 0.7541666666666668 | 0 |
| 0.7548611111111111 | 0 |
| 0.7555555555555555 | 0 |
| 0.75625 | 0 |
| 0.7569444444444445 | 0 |
| 0.7576388888888889 | 0 |
| 0.7583333333333333 | 0 |
| 0.7590277777777777 | 0 |
| 0.7597222222222223 | 0 |
| 0.7604166666666666 | 0 |
| 0.7611111111111111 | 0 |
| 0.7618055555555556 | 0 |
| 0.7625000000000001 | 0 |
| 0.7631944444444444 | 0 |
| 0.7638888888888888 | 0 |
| 0.7645833333333334 | 0 |
| 0.7652777777777778 | 0 |
| 0.7659722222222222 | 0 |
| 0.7666666666666666 | 0 |
| 0.7673611111111112 | 0 |
| 0.7680555555555556 | 0 |
| 0.7687499999999999 | 0 |
| 0.7694444444444444 | 0 |
| 0.7701388888888889 | 0 |
| 0.7708333333333334 | 0 |
| 0.7715277777777777 | 0 |
| 0.7722222222222223 | 0 |
| 0.7729166666666667 | 0 |
| 0.7736111111111111 | 0 |
| 0.7743055555555555 | 0 |
| 0.775 | 0 |
| 0.7756944444444445 | 0 |
| 0.7763888888888889 | 0 |
| 0.7770833333333332 | 0 |
| 0.7777777777777778 | 0 |
| 0.7784722222222222 | 0 |
| 0.7791666666666667 | 0 |
| 0.779861111111111 | 0 |
| 0.7805555555555556 | 0 |
| 0.78125 | 0 |
| 0.7819444444444444 | 0 |
| 0.782638888888889 | 0 |
| 0.7833333333333333 | 0 |
| 0.7840277777777778 | 0 |
| 0.7847222222222222 | 0 |
| 0.7854166666666668 | 0 |
| 0.7861111111111111 | 0 |
| 0.7868055555555555 | 0 |
| 0.7875 | 0 |
| 0.7881944444444445 | 0 |
| 0.7888888888888889 | 0 |
| 0.7895833333333333 | 0 |
| 0.7902777777777777 | 0 |
| 0.7909722222222223 | 0 |
| 0.7916666666666666 | 0 |
| 0.7923611111111111 | 0 |
| 0.7930555555555556 | 0 |
| 0.7937500000000001 | 0 |
| 0.7944444444444444 | 0 |
| 0.7951388888888888 | 0 |
| 0.7958333333333334 | 0 |
| 0.7965277777777778 | 0 |
| 0.7972222222222222 | 0 |
| 0.7979166666666666 | 0 |
| 0.7986111111111112 | 0 |
| 0.7993055555555556 | 0 |
| 0.7999999999999999 | 0 |
| 0.8006944444444444 | 0 |
| 0.8013888888888889 | 0 |
| 0.8020833333333334 | 0 |
| 0.8027777777777777 | 0 |
| 0.8034722222222223 | 0 |
| 0.8041666666666667 | 0 |
| 0.8048611111111111 | 0 |
| 0.8055555555555555 | 0 |
| 0.80625 | 0 |
| 0.8069444444444445 | 0 |
| 0.8076388888888889 | 0 |
| 0.8083333333333332 | 0 |
| 0.8090277777777778 | 0 |
| 0.8097222222222222 | 0 |
| 0.8104166666666667 | 0 |
| 0.811111111111111 | 0 |
| 0.8118055555555556 | 0 |
| 0.8125 | 0 |
| 0.8131944444444444 | 0 |
| 0.813888888888889 | 0 |
| 0.8145833333333333 | 0 |
| 0.8152777777777778 | 0 |
| 0.8159722222222222 | 0 |
| 0.8166666666666668 | 0 |
| 0.8173611111111111 | 0 |
| 0.8180555555555555 | 0 |
| 0.81875 | 0 |
| 0.8194444444444445 | 0 |
| 0.8201388888888889 | 0 |
| 0.8208333333333333 | 0 |
| 0.8215277777777777 | 0 |
| 0.8222222222222223 | 0 |
| 0.8229166666666666 | 0 |
| 0.8236111111111111 | 0 |
| 0.8243055555555556 | 0 |
| 0.8250000000000001 | 0 |
| 0.8256944444444444 | 0 |
| 0.8263888888888888 | 0 |
| 0.8270833333333334 | 0 |
| 0.8277777777777778 | 0 |
| 0.8284722222222222 | 0 |
| 0.8291666666666666 | 0 |
| 0.8298611111111112 | 0 |
| 0.8305555555555556 | 0 |
| 0.8312499999999999 | 0 |
| 0.8319444444444444 | 0 |
| 0.8326388888888889 | 0 |
| 0.8333333333333334 | 0 |
| 0.8340277777777777 | 0 |
| 0.8347222222222223 | 0 |
| 0.8354166666666667 | 0 |
| 0.8361111111111111 | 0 |
| 0.8368055555555555 | 0 |
| 0.8375 | 0 |
| 0.8381944444444445 | 0 |
| 0.8388888888888889 | 0 |
| 0.8395833333333332 | 0 |
| 0.8402777777777778 | 0 |
| 0.8409722222222222 | 0 |
| 0.8416666666666667 | 0 |
| 0.842361111111111 | 0 |
| 0.8430555555555556 | 0 |
| 0.84375 | 0 |
| 0.8444444444444444 | 0 |
| 0.845138888888889 | 0 |
| 0.8458333333333333 | 0 |
| 0.8465277777777778 | 0 |
| 0.8472222222222222 | 0 |
| 0.8479166666666668 | 0 |
| 0.8486111111111111 | 0 |
| 0.8493055555555555 | 0 |
| 0.85 | 0 |
| 0.8506944444444445 | 0 |
| 0.8513888888888889 | 0 |
| 0.8520833333333333 | 0 |
| 0.8527777777777777 | 0 |
| 0.8534722222222223 | 0 |
| 0.8541666666666666 | 0 |
| 0.8548611111111111 | 0 |
| 0.8555555555555556 | 0 |
| 0.8562500000000001 | 0 |
| 0.8569444444444444 | 0 |
| 0.8576388888888888 | 0 |
| 0.8583333333333334 | 0 |
| 0.8590277777777778 | 0 |
| 0.8597222222222222 | 0 |
| 0.8604166666666666 | 0 |
| 0.8611111111111112 | 0 |
| 0.8618055555555556 | 0 |
| 0.8624999999999999 | 0 |
| 0.8631944444444444 | 0 |
| 0.8638888888888889 | 0 |
| 0.8645833333333334 | 0 |
| 0.8652777777777777 | 0 |
| 0.8659722222222223 | 0 |
| 0.8666666666666667 | 0 |
| 0.8673611111111111 | 0 |
| 0.8680555555555555 | 0 |
| 0.86875 | 0 |
| 0.8694444444444445 | 0 |
| 0.8701388888888889 | 0 |
| 0.8708333333333332 | 0 |
| 0.8715277777777778 | 0 |
| 0.8722222222222222 | 0 |
| 0.8729166666666667 | 0 |
| 0.873611111111111 | 0 |
| 0.8743055555555556 | 0 |
| 0.875 | 0 |
| 0.8756944444444444 | 0 |
| 0.876388888888889 | 0 |
| 0.8770833333333333 | 0 |
| 0.8777777777777778 | 0 |
| 0.8784722222222222 | 0 |
| 0.8791666666666668 | 0 |
| 0.8798611111111111 | 0 |
| 0.8805555555555555 | 0 |
| 0.88125 | 0 |
| 0.8819444444444445 | 0 |
| 0.8826388888888889 | 0 |
| 0.8833333333333333 | 0 |
| 0.8840277777777777 | 0 |
| 0.8847222222222223 | 0 |
| 0.8854166666666666 | 0 |
| 0.8861111111111111 | 0 |
| 0.8868055555555556 | 0 |
| 0.8875000000000001 | 0 |
| 0.8881944444444444 | 0 |
| 0.8888888888888888 | 0 |
| 0.8895833333333334 | 0 |
| 0.8902777777777778 | 0 |
| 0.8909722222222222 | 0 |
| 0.8916666666666666 | 0 |
| 0.8923611111111112 | 0 |
| 0.8930555555555556 | 0 |
| 0.8937499999999999 | 0 |
| 0.8944444444444444 | 0 |
| 0.8951388888888889 | 0 |
| 0.8958333333333334 | 0 |
| 0.8965277777777777 | 0 |
| 0.8972222222222223 | 0 |
| 0.8979166666666667 | 0 |
| 0.8986111111111111 | 0 |
| 0.8993055555555555 | 0 |
| 0.9 | 0 |
| 0.9006944444444445 | 0 |
| 0.9013888888888889 | 0 |
| 0.9020833333333332 | 0 |
| 0.9027777777777778 | 0 |
| 0.9034722222222222 | 0 |
| 0.9041666666666667 | 0 |
| 0.904861111111111 | 0 |
| 0.9055555555555556 | 0 |
| 0.90625 | 0 |
| 0.9069444444444444 | 0 |
| 0.907638888888889 | 0 |
| 0.9083333333333333 | 0 |
| 0.9090277777777778 | 0 |
| 0.9097222222222222 | 0 |
| 0.9104166666666668 | 0 |
| 0.9111111111111111 | 0 |
| 0.9118055555555555 | 0 |
| 0.9125 | 0 |
| 0.9131944444444445 | 0 |
| 0.9138888888888889 | 0 |
| 0.9145833333333333 | 0 |
| 0.9152777777777777 | 0 |
| 0.9159722222222223 | 0 |
| 0.9166666666666666 | 0 |
| 0.9173611111111111 | 0 |
| 0.9180555555555556 | 0 |
| 0.9187500000000001 | 0 |
| 0.9194444444444444 | 0 |
| 0.9201388888888888 | 0 |
| 0.9208333333333334 | 0 |
| 0.9215277777777778 | 0 |
| 0.9222222222222222 | 0 |
| 0.9229166666666666 | 0 |
| 0.9236111111111112 | 0 |
| 0.9243055555555556 | 0 |
| 0.9249999999999999 | 0 |
| 0.9256944444444444 | 0 |
| 0.9263888888888889 | 0 |
| 0.9270833333333334 | 0 |
| 0.9277777777777777 | 0 |
| 0.9284722222222223 | 0 |
| 0.9291666666666667 | 0 |
| 0.9298611111111111 | 0 |
| 0.9305555555555555 | 0 |
| 0.93125 | 0 |
| 0.9319444444444445 | 0 |
| 0.9326388888888889 | 0 |
| 0.9333333333333332 | 0 |
| 0.9340277777777778 | 0 |
| 0.9347222222222222 | 0 |
| 0.9354166666666667 | 0 |
| 0.936111111111111 | 0 |
| 0.9368055555555556 | 0 |
| 0.9375 | 0 |
| 0.9381944444444444 | 0 |
| 0.938888888888889 | 0 |
| 0.9395833333333333 | 0 |
| 0.9402777777777778 | 0 |
| 0.9409722222222222 | 0 |
| 0.9416666666666668 | 0 |
| 0.9423611111111111 | 0 |
| 0.9430555555555555 | 0 |
| 0.94375 | 0 |
| 0.9444444444444445 | 0 |
| 0.9451388888888889 | 0 |
| 0.9458333333333333 | 0 |
| 0.9465277777777777 | 0 |
| 0.9472222222222223 | 0 |
| 0.9479166666666666 | 0 |
| 0.9486111111111111 | 0 |
| 0.9493055555555556 | 0 |
| 0.9500000000000001 | 0 |
| 0.9506944444444444 | 0 |
| 0.9513888888888888 | 0 |
| 0.9520833333333334 | 0 |
| 0.9527777777777778 | 0 |
| 0.9534722222222222 | 0 |
| 0.9541666666666666 | 0 |
| 0.9548611111111112 | 0 |
| 0.9555555555555556 | 0 |
| 0.9562499999999999 | 0 |
| 0.9569444444444444 | 0 |
| 0.9576388888888889 | 0 |
| 0.9583333333333334 | 0 |
| 0.9590277777777777 | 0 |
| 0.9597222222222223 | 0 |
| 0.9604166666666667 | 0 |
| 0.9611111111111111 | 0 |
| 0.9618055555555555 | 0 |
| 0.9625 | 0 |
| 0.9631944444444445 | 0 |
| 0.9638888888888889 | 0 |
| 0.9645833333333332 | 0 |
| 0.9652777777777778 | 0 |
| 0.9659722222222222 | 0 |
| 0.9666666666666667 | 0 |
| 0.967361111111111 | 0 |
| 0.9680555555555556 | 0 |
| 0.96875 | 0 |
| 0.9694444444444444 | 0 |
| 0.970138888888889 | 0 |
| 0.9708333333333333 | 0 |
| 0.9715277777777778 | 0 |
| 0.9722222222222222 | 0 |
| 0.9729166666666668 | 0 |
| 0.9736111111111111 | 0 |
| 0.9743055555555555 | 0 |
| 0.975 | 0 |
| 0.9756944444444445 | 0 |
| 0.9763888888888889 | 0 |
| 0.9770833333333333 | 0 |
| 0.9777777777777777 | 0 |
| 0.9784722222222223 | 0 |
| 0.9791666666666666 | 0 |
| 0.9798611111111111 | 0 |
| 0.9805555555555556 | 0 |
| 0.9812500000000001 | 0 |
| 0.9819444444444444 | 0 |
| 0.9826388888888888 | 0 |
| 0.9833333333333334 | 0 |
| 0.9840277777777778 | 0 |
| 0.9847222222222222 | 0 |
| 0.9854166666666666 | 0 |
| 0.9861111111111112 | 0 |
| 0.9868055555555556 | 0 |
| 0.9874999999999999 | 0 |
| 0.9881944444444444 | 0 |
| 0.9888888888888889 | 0 |
| 0.9895833333333334 | 0 |
| 0.9902777777777777 | 0 |
| 0.9909722222222223 | 0 |
| 0.9916666666666667 | 0 |
| 0.9923611111111111 | 0 |
| 0.9930555555555555 | 0 |
| 0.99375 | 0 |
| 0.9944444444444445 | 0 |
| 0.9951388888888889 | 0 |
| 0.9958333333333332 | 0 |
| 0.9965277777777778 | 0 |
| 0.9972222222222222 | 0 |
| 0.9979166666666667 | 0 |
| 0.998611111111111 | 0 |
| 0.9993055555555556 | 0 |